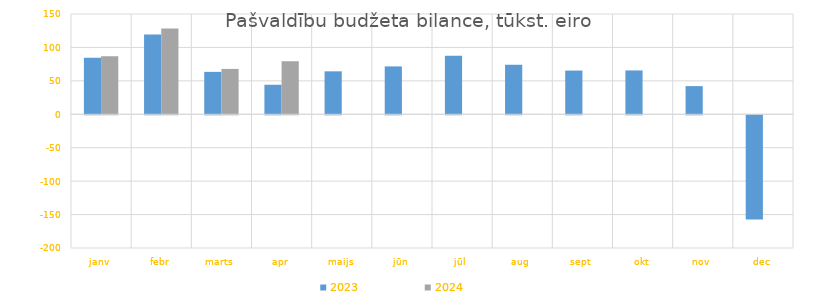
| Category | 2023 | 2024 |
|---|---|---|
| janv | 84479.098 | 86956.73 |
| febr | 119462.892 | 128177.757 |
| marts | 63449.124 | 67846.929 |
| apr | 44164.06 | 79179.795 |
| maijs | 64247.066 | 0 |
| jūn | 71601.894 | 0 |
| jūl | 87551.97 | 0 |
| aug | 74225.888 | 0 |
| sept | 65410.327 | 0 |
| okt | 65576.429 | 0 |
| nov | 42139.59 | 0 |
| dec | -156000.116 | 0 |